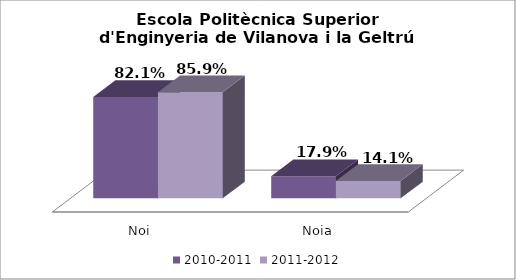
| Category | 2010-2011 | 2011-2012 |
|---|---|---|
| Noi | 0.821 | 0.859 |
| Noia | 0.179 | 0.141 |